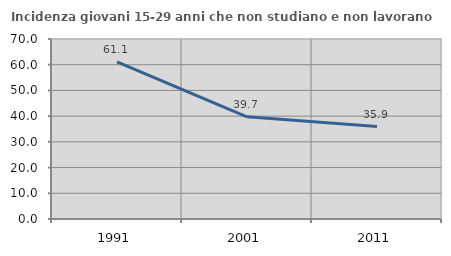
| Category | Incidenza giovani 15-29 anni che non studiano e non lavorano  |
|---|---|
| 1991.0 | 61.137 |
| 2001.0 | 39.744 |
| 2011.0 | 35.938 |